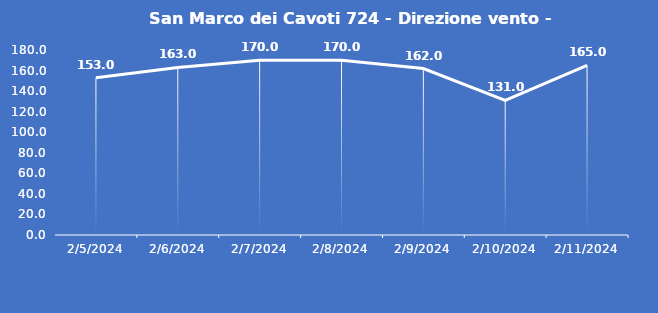
| Category | San Marco dei Cavoti 724 - Direzione vento - Grezzo (°N) |
|---|---|
| 2/5/24 | 153 |
| 2/6/24 | 163 |
| 2/7/24 | 170 |
| 2/8/24 | 170 |
| 2/9/24 | 162 |
| 2/10/24 | 131 |
| 2/11/24 | 165 |